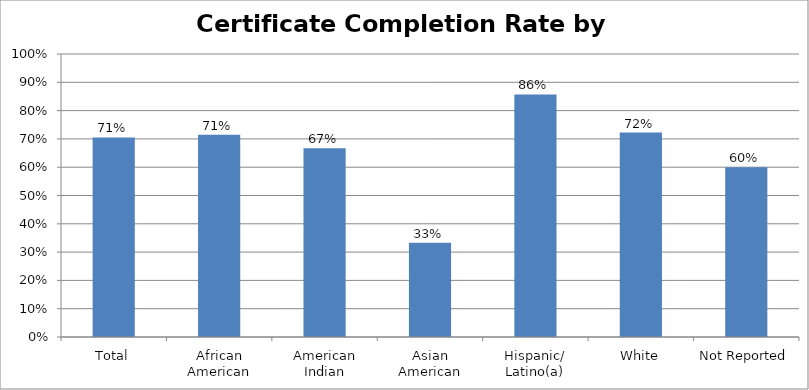
| Category | Certificate Completion Rate by Race/Ethnicity |
|---|---|
| Total | 0.705 |
| African American | 0.714 |
| American Indian | 0.667 |
| Asian American | 0.333 |
| Hispanic/ Latino(a) | 0.857 |
| White | 0.722 |
| Not Reported | 0.6 |